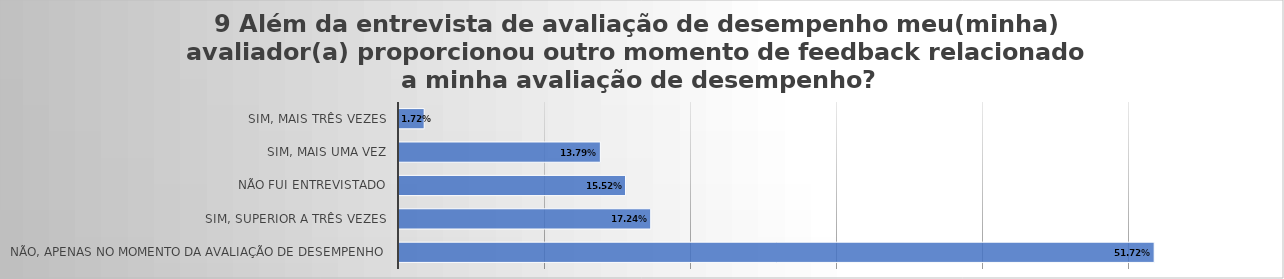
| Category | 9 Além da entrevista de avaliação de desempenho meu(minha) avaliador(a) proporcionou outro momento de feedback relacionado a minha avaliação de desempenho? |
|---|---|
| Não, apenas no momento da avaliação de desempenho | 0.517 |
| Sim, superior a três vezes | 0.172 |
| Não fui entrevistado | 0.155 |
| Sim, mais uma vez | 0.138 |
| Sim, mais três vezes | 0.017 |